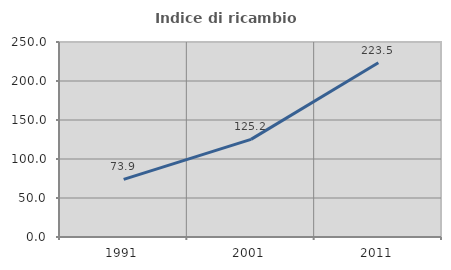
| Category | Indice di ricambio occupazionale  |
|---|---|
| 1991.0 | 73.913 |
| 2001.0 | 125.193 |
| 2011.0 | 223.51 |